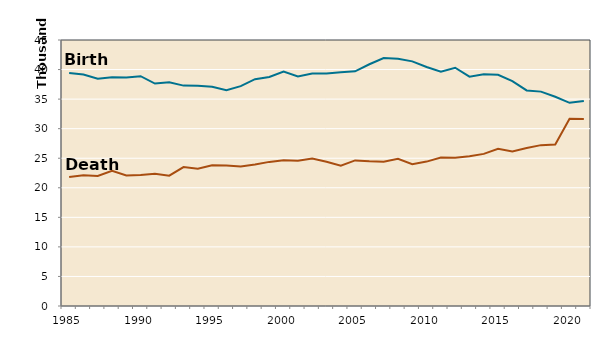
| Category | Births | Deaths |
|---|---|---|
| 1985.0 | 39418 | 21808 |
| 1986.0 | 39177 | 22133 |
| 1987.0 | 38435 | 21995 |
| 1988.0 | 38718 | 22889 |
| 1989.0 | 38648 | 22082 |
| 1990.0 | 38872 | 22173 |
| 1991.0 | 37630 | 22363 |
| 1992.0 | 37848 | 22052 |
| 1993.0 | 37283 | 23508 |
| 1994.0 | 37269 | 23219 |
| 1995.0 | 37087 | 23807 |
| 1996.0 | 36524 | 23788 |
| 1997.0 | 37191 | 23609 |
| 1998.0 | 38372 | 23928 |
| 1999.0 | 38748 | 24380 |
| 2000.0 | 39654 | 24676 |
| 2001.0 | 38832 | 24590 |
| 2002.0 | 39338 | 24968 |
| 2003.0 | 39353 | 24417 |
| 2004.0 | 39553 | 23720 |
| 2005.0 | 39701 | 24632 |
| 2006.0 | 40896 | 24489 |
| 2007.0 | 41951 | 24413 |
| 2008.0 | 41815 | 24896 |
| 2009.0 | 41388 | 23997 |
| 2010.0 | 40439 | 24428 |
| 2011.0 | 39628 | 25114 |
| 2012.0 | 40304 | 25084 |
| 2013.0 | 38805 | 25347 |
| 2014.0 | 39193 | 25731 |
| 2015.0 | 39126 | 26611 |
| 2016.0 | 38048 | 26129 |
| 2017.0 | 36464 | 26725 |
| 2018.0 | 36268 | 27213 |
| 2019.0 | 35395 | 27312 |
| 2020.0 | 34368 | 31667 |
| 2021.0 | 34697 | 31637 |